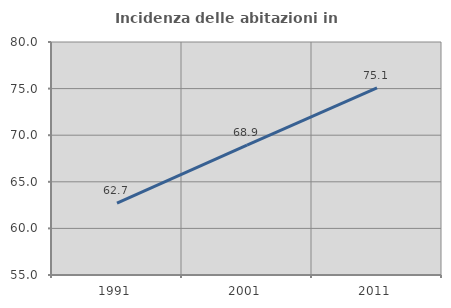
| Category | Incidenza delle abitazioni in proprietà  |
|---|---|
| 1991.0 | 62.721 |
| 2001.0 | 68.935 |
| 2011.0 | 75.08 |